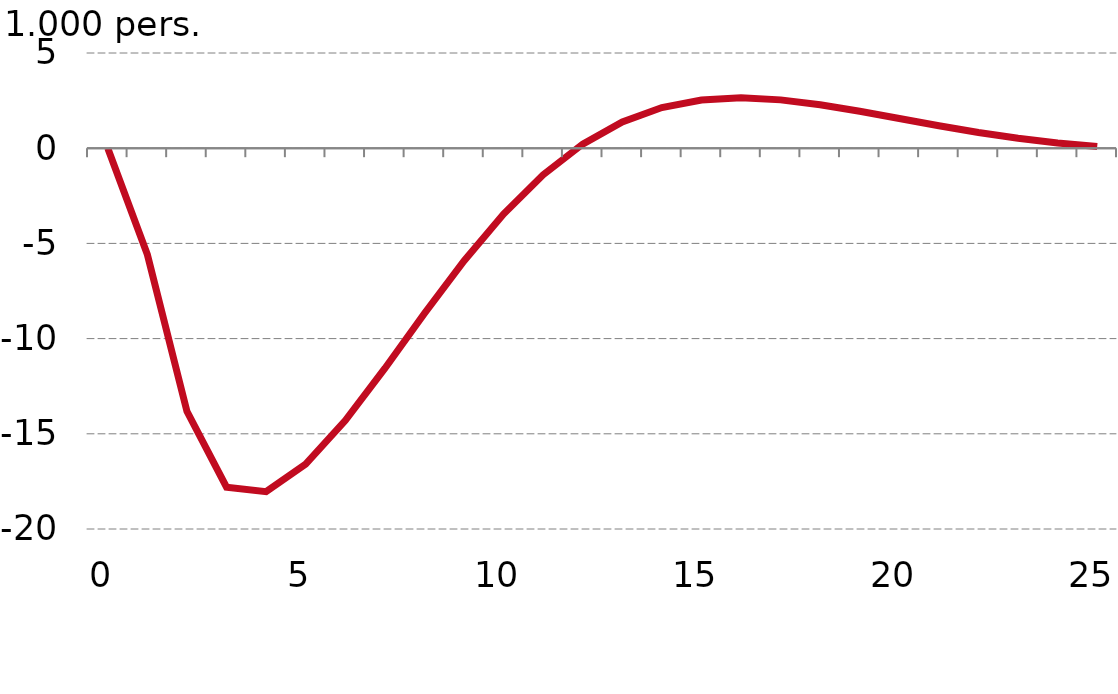
| Category |  Serie1 |
|---|---|
| 0.0 | 0 |
| nan | -5.585 |
| nan | -13.82 |
| nan | -17.802 |
| nan | -18.042 |
| 5.0 | -16.587 |
| nan | -14.304 |
| nan | -11.567 |
| nan | -8.686 |
| nan | -5.922 |
| 10.0 | -3.457 |
| nan | -1.397 |
| nan | 0.215 |
| nan | 1.381 |
| nan | 2.135 |
| 15.0 | 2.533 |
| nan | 2.644 |
| nan | 2.538 |
| nan | 2.284 |
| nan | 1.94 |
| 20.0 | 1.559 |
| nan | 1.178 |
| nan | 0.827 |
| nan | 0.523 |
| nan | 0.275 |
| 25.0 | 0.086 |